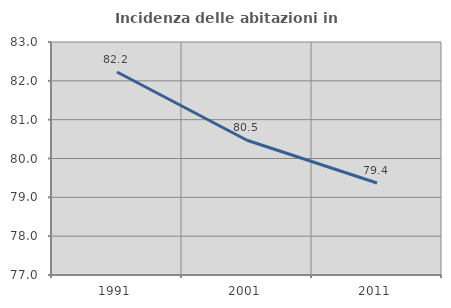
| Category | Incidenza delle abitazioni in proprietà  |
|---|---|
| 1991.0 | 82.228 |
| 2001.0 | 80.47 |
| 2011.0 | 79.37 |